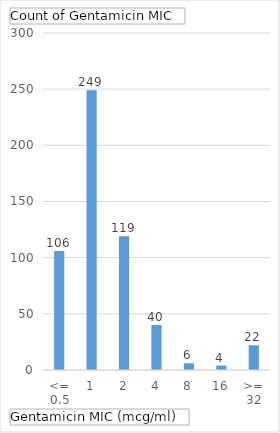
| Category | Total |
|---|---|
| <= 0.5 | 106 |
| 1 | 249 |
| 2 | 119 |
| 4 | 40 |
| 8 | 6 |
| 16 | 4 |
| >= 32 | 22 |